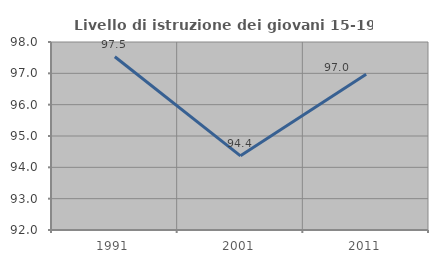
| Category | Livello di istruzione dei giovani 15-19 anni |
|---|---|
| 1991.0 | 97.531 |
| 2001.0 | 94.366 |
| 2011.0 | 96.97 |